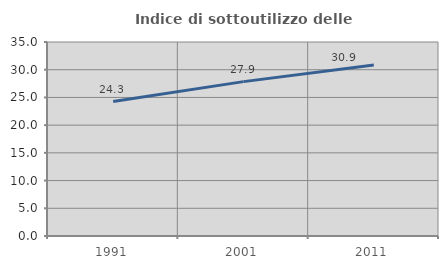
| Category | Indice di sottoutilizzo delle abitazioni  |
|---|---|
| 1991.0 | 24.259 |
| 2001.0 | 27.853 |
| 2011.0 | 30.861 |